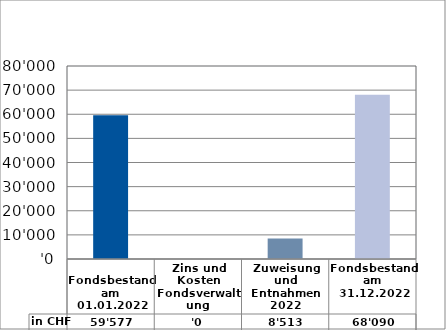
| Category | in CHF |
|---|---|
| 
Fondsbestand am 01.01.2022

 | 59576.8 |
| Zins und Kosten Fondsverwaltung | 0 |
| Zuweisung und Entnahmen 2022 | 8513 |
| Fondsbestand am 31.12.2022 | 68089.8 |